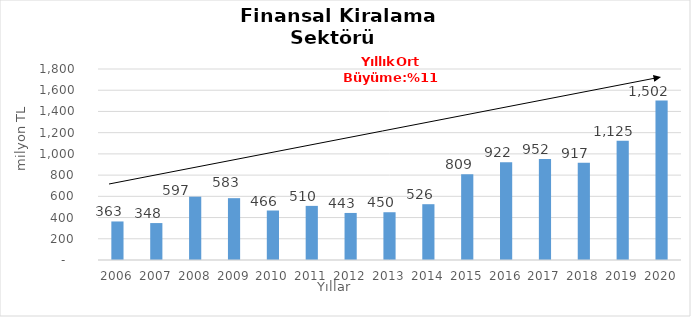
| Category | Finansal Kiralama  |
|---|---|
| 2006.0 | 363.206 |
| 2007.0 | 348.066 |
| 2008.0 | 596.686 |
| 2009.0 | 582.74 |
| 2010.0 | 466.416 |
| 2011.0 | 509.999 |
| 2012.0 | 443.41 |
| 2013.0 | 450.17 |
| 2014.0 | 525.856 |
| 2015.0 | 809 |
| 2016.0 | 922 |
| 2017.0 | 952 |
| 2018.0 | 917 |
| 2019.0 | 1125 |
| 2020.0 | 1502 |